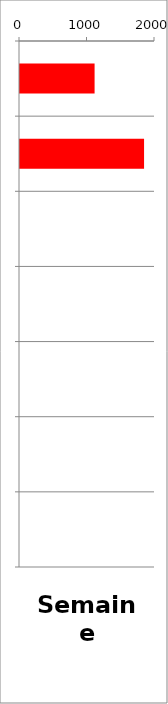
| Category | VL |
|---|---|
| 0 | 1105 |
| 1 | 1838 |
| 2 | 0 |
| 3 | 0 |
| 4 | 0 |
| 5 | 0 |
| 6 | 0 |